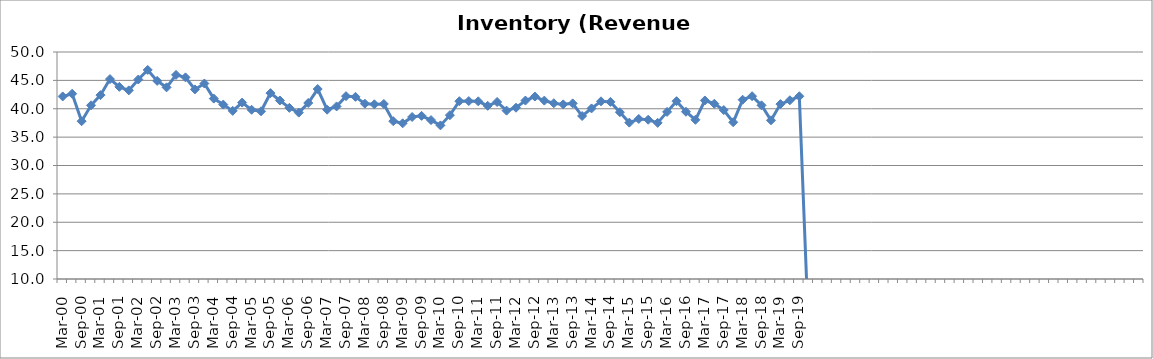
| Category | Inventory (Revenue Days) |
|---|---|
| Mar-00 | 42.166 |
| Jun-00 | 42.645 |
| Sep-00 | 37.807 |
| Dec-00 | 40.606 |
| Mar-01 | 42.398 |
| Jun-01 | 45.226 |
| Sep-01 | 43.858 |
| Dec-01 | 43.236 |
| Mar-02 | 45.15 |
| Jun-02 | 46.841 |
| Sep-02 | 44.907 |
| Dec-02 | 43.77 |
| Mar-03 | 45.965 |
| Jun-03 | 45.528 |
| Sep-03 | 43.407 |
| Dec-03 | 44.448 |
| Mar-04 | 41.791 |
| Jun-04 | 40.738 |
| Sep-04 | 39.626 |
| Dec-04 | 41.088 |
| Mar-05 | 39.823 |
| Jun-05 | 39.551 |
| Sep-05 | 42.756 |
| Dec-05 | 41.461 |
| Mar-06 | 40.159 |
| Jun-06 | 39.323 |
| Sep-06 | 41.016 |
| Dec-06 | 43.472 |
| Mar-07 | 39.83 |
| Jun-07 | 40.408 |
| Sep-07 | 42.219 |
| Dec-07 | 42.096 |
| Mar-08 | 40.893 |
| Jun-08 | 40.781 |
| Sep-08 | 40.843 |
| Dec-08 | 37.811 |
| Mar-09 | 37.436 |
| Jun-09 | 38.548 |
| Sep-09 | 38.749 |
| Dec-09 | 37.999 |
| Mar-10 | 37.067 |
| Jun-10 | 38.871 |
| Sep-10 | 41.327 |
| Dec-10 | 41.352 |
| Mar-11 | 41.309 |
| Jun-11 | 40.517 |
| Sep-11 | 41.196 |
| Dec-11 | 39.669 |
| Mar-12 | 40.183 |
| Jun-12 | 41.445 |
| Sep-12 | 42.152 |
| Dec-12 | 41.432 |
| Mar-13 | 40.972 |
| Jun-13 | 40.772 |
| Sep-13 | 40.946 |
| Dec-13 | 38.718 |
| Mar-14 | 40.058 |
| Jun-14 | 41.307 |
| Sep-14 | 41.21 |
| Dec-14 | 39.395 |
| Mar-15 | 37.553 |
| Jun-15 | 38.199 |
| Sep-15 | 38.062 |
| Dec-15 | 37.512 |
| Mar-16 | 39.448 |
| Jun-16 | 41.33 |
| Sep-16 | 39.473 |
| Dec-16 | 38.052 |
| Mar-17 | 41.459 |
| Jun-17 | 40.885 |
| Sep-17 | 39.777 |
| Dec-17 | 37.624 |
| Mar-18 | 41.588 |
| Jun-18 | 42.209 |
| Sep-18 | 40.606 |
| Dec-18 | 37.964 |
| Mar-19 | 40.82 |
| Jun-19 | 41.494 |
| Sep-19 | 42.198 |